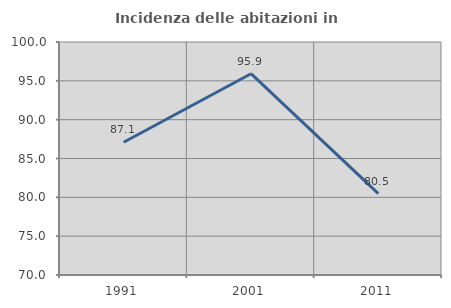
| Category | Incidenza delle abitazioni in proprietà  |
|---|---|
| 1991.0 | 87.097 |
| 2001.0 | 95.918 |
| 2011.0 | 80.488 |